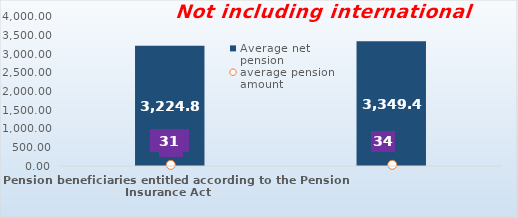
| Category | Average net pension  |
|---|---|
| Pension beneficiaries entitled according to the Pension Insurance Act   | 3224.88 |
| Pension beneficiaries entitled to pension FOR THE FIRST TIME in 2022 according to the Pension Insurance Act  - NEW BENEFICIARIES | 3349.469 |